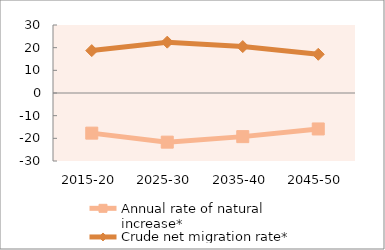
| Category | Annual rate of natural increase* | Crude net migration rate* |
|---|---|---|
| 2015-20 | -17.706 | 18.703 |
| 2025-30 | -21.682 | 22.43 |
| 2035-40 | -19.247 | 20.481 |
| 2045-50 | -15.863 | 17.084 |